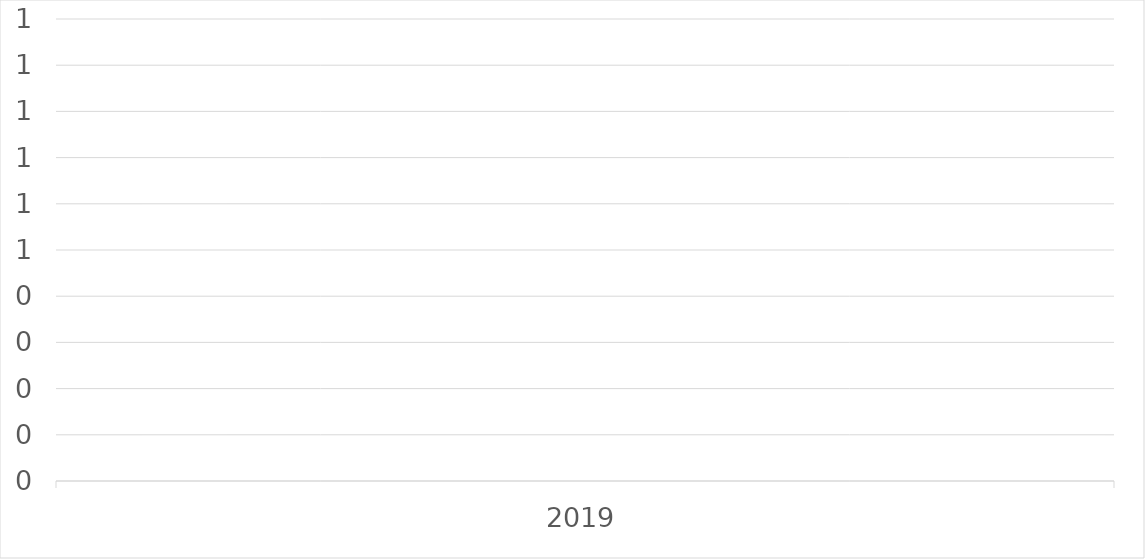
| Category | Series 0 |
|---|---|
| 2019 | 0 |